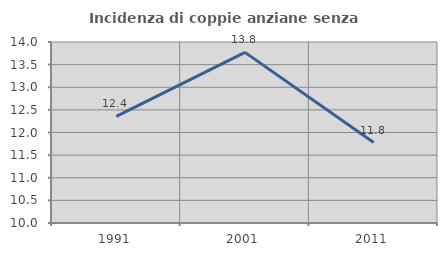
| Category | Incidenza di coppie anziane senza figli  |
|---|---|
| 1991.0 | 12.355 |
| 2001.0 | 13.77 |
| 2011.0 | 11.779 |